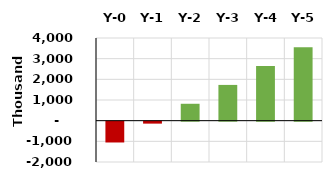
| Category | Series 0 |
|---|---|
| Y-0 | -1007040 |
| Y-1 | -94738.462 |
| Y-2 | 817563.077 |
| Y-3 | 1729864.615 |
| Y-4 | 2642166.154 |
| Y-5 | 3554467.692 |